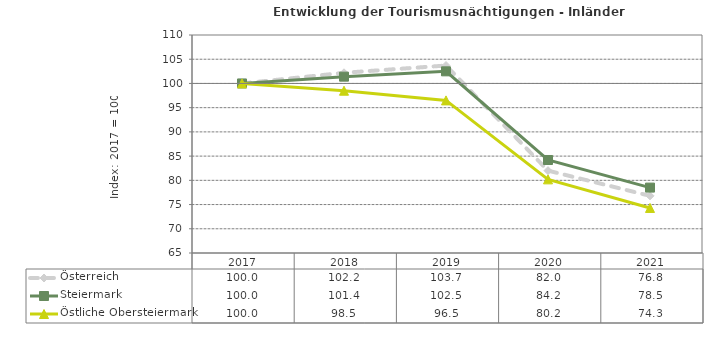
| Category | Österreich | Steiermark | Östliche Obersteiermark |
|---|---|---|---|
| 2021.0 | 76.8 | 78.5 | 74.3 |
| 2020.0 | 82 | 84.2 | 80.2 |
| 2019.0 | 103.7 | 102.5 | 96.5 |
| 2018.0 | 102.2 | 101.4 | 98.5 |
| 2017.0 | 100 | 100 | 100 |